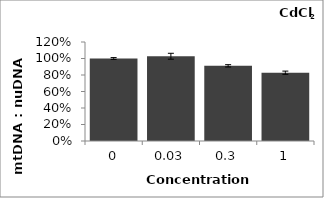
| Category | Series 1 |
|---|---|
| 0.0 | 1 |
| 0.03 | 1.027 |
| 0.3 | 0.911 |
| 1.0 | 0.828 |